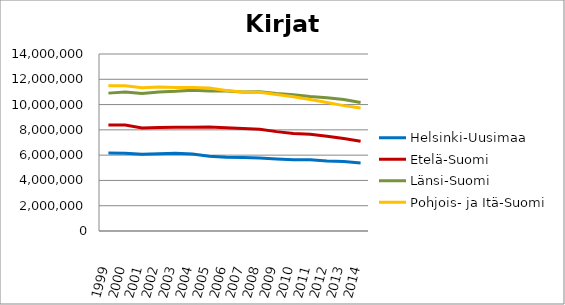
| Category | Helsinki-Uusimaa | Etelä-Suomi | Länsi-Suomi | Pohjois- ja Itä-Suomi |
|---|---|---|---|---|
| 1999.0 | 6159665 | 8382179 | 10905341 | 11493017 |
| 2000.0 | 6141667 | 8389056 | 10990656 | 11491666 |
| 2001.0 | 6071888 | 8149932 | 10875047 | 11338623 |
| 2002.0 | 6112907 | 8186839 | 10994403 | 11383364 |
| 2003.0 | 6158604 | 8214558 | 11047747 | 11357787 |
| 2004.0 | 6094339 | 8204244 | 11130757 | 11350046 |
| 2005.0 | 5912312 | 8226147 | 11069005 | 11318271 |
| 2006.0 | 5835683 | 8169474 | 11064796 | 11115074 |
| 2007.0 | 5808694 | 8106319 | 10993101 | 10993052 |
| 2008.0 | 5767009 | 8048553 | 11012205 | 10965469 |
| 2009.0 | 5687038 | 7859497 | 10877091 | 10803701 |
| 2010.0 | 5626319 | 7720838 | 10774239 | 10618625 |
| 2011.0 | 5636340 | 7647606 | 10629637 | 10399439 |
| 2012.0 | 5544820 | 7495880 | 10531547 | 10156575 |
| 2013.0 | 5492978 | 7308320 | 10398066 | 9917930 |
| 2014.0 | 5385354 | 7091317 | 10163276 | 9721459 |